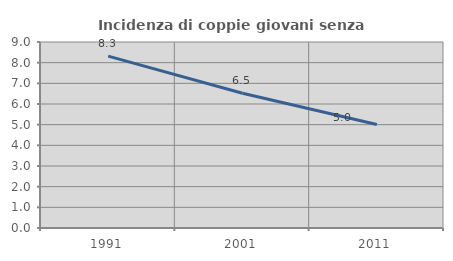
| Category | Incidenza di coppie giovani senza figli |
|---|---|
| 1991.0 | 8.319 |
| 2001.0 | 6.522 |
| 2011.0 | 5.007 |